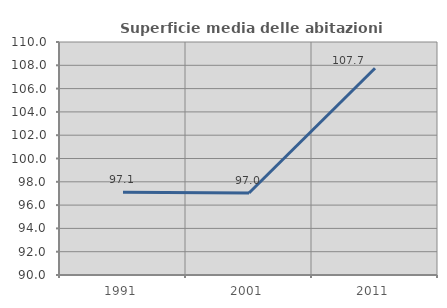
| Category | Superficie media delle abitazioni occupate |
|---|---|
| 1991.0 | 97.106 |
| 2001.0 | 97.042 |
| 2011.0 | 107.744 |